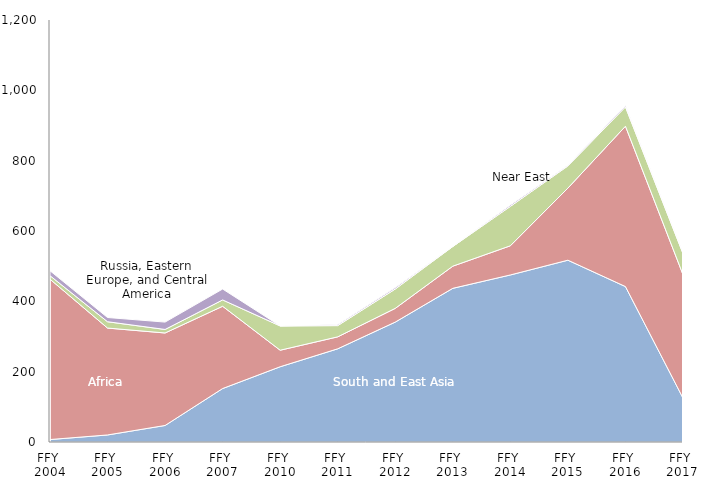
| Category | South and East Asia | African | Near East | Russia, Eastern Europe, and Central America |
|---|---|---|---|---|
| FFY 
2004 | 7 | 456 | 10 | 14 |
| FFY 
2005 | 20 | 304 | 18 | 12 |
| FFY 
2006 | 47 | 263 | 10 | 21 |
| FFY 
2007 | 152 | 234 | 18 | 31 |
| FFY 
2010 | 214 | 47 | 69 | 0 |
| FFY 
2011 | 265 | 34 | 32 | 3 |
| FFY 
2012 | 341 | 39 | 55 | 4 |
| FFY 
2013 | 437 | 63 | 56 | 0 |
| FFY 
2014 | 475 | 83 | 112 | 4 |
| FFY 
2015 | 517 | 205 | 63 | 2 |
| FFY 
2016 | 442 | 456 | 55 | 4 |
| FFY 
2017 | 125 | 351 | 60 | 2 |